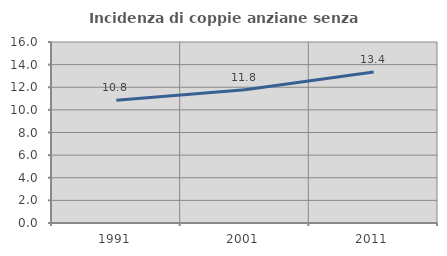
| Category | Incidenza di coppie anziane senza figli  |
|---|---|
| 1991.0 | 10.843 |
| 2001.0 | 11.787 |
| 2011.0 | 13.356 |